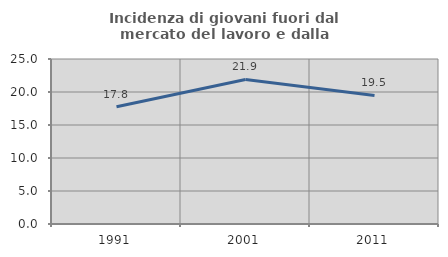
| Category | Incidenza di giovani fuori dal mercato del lavoro e dalla formazione  |
|---|---|
| 1991.0 | 17.764 |
| 2001.0 | 21.895 |
| 2011.0 | 19.474 |